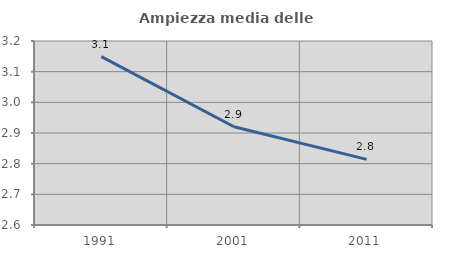
| Category | Ampiezza media delle famiglie |
|---|---|
| 1991.0 | 3.149 |
| 2001.0 | 2.92 |
| 2011.0 | 2.814 |